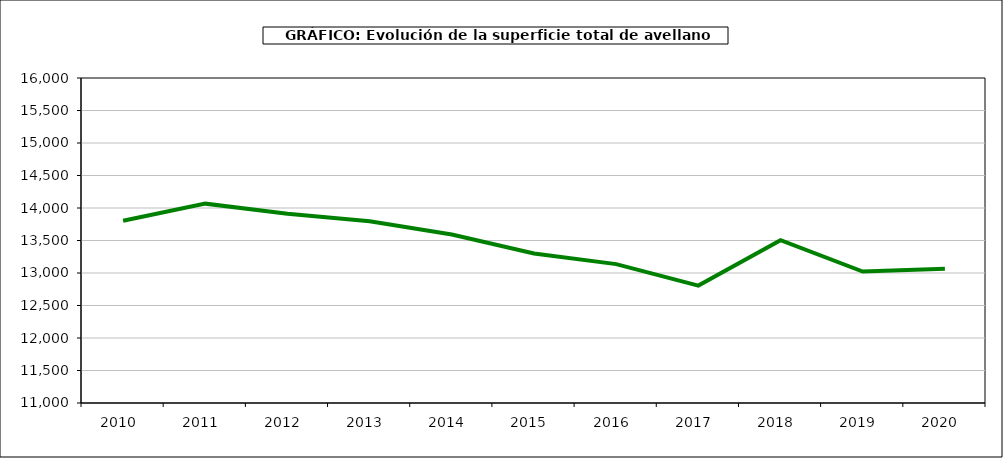
| Category | superficie avellano |
|---|---|
| 2010.0 | 13803 |
| 2011.0 | 14067 |
| 2012.0 | 13912 |
| 2013.0 | 13796 |
| 2014.0 | 13591 |
| 2015.0 | 13301 |
| 2016.0 | 13137 |
| 2017.0 | 12806 |
| 2018.0 | 13505 |
| 2019.0 | 13023 |
| 2020.0 | 13067 |